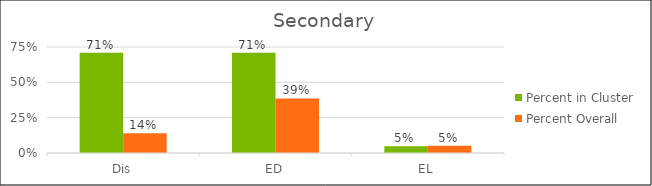
| Category | Percent in Cluster | Percent Overall |
|---|---|---|
| Dis | 0.71 | 0.14 |
| ED | 0.71 | 0.386 |
| EL | 0.048 | 0.052 |